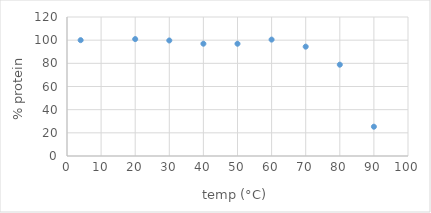
| Category | Series 0 |
|---|---|
| 4.0 | 100 |
| 20.0 | 100.939 |
| 30.0 | 99.73 |
| 40.0 | 96.942 |
| 50.0 | 96.916 |
| 60.0 | 100.482 |
| 70.0 | 94.398 |
| 80.0 | 78.832 |
| 90.0 | 25.281 |